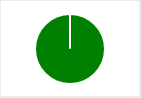
| Category | Maximal level of satisfaction (all criteria scored 3) |
|---|---|
| 0 | 1 |